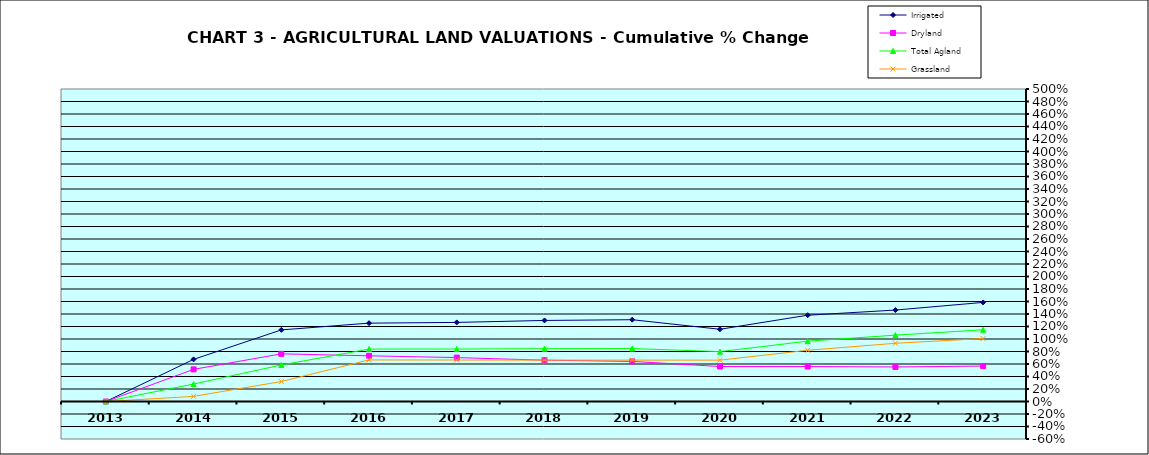
| Category | Irrigated | Dryland | Total Agland | Grassland |
|---|---|---|---|---|
| 2013.0 | 0 | 0 | 0 | 0 |
| 2014.0 | 0.674 | 0.514 | 0.279 | 0.082 |
| 2015.0 | 1.146 | 0.762 | 0.584 | 0.319 |
| 2016.0 | 1.254 | 0.731 | 0.839 | 0.665 |
| 2017.0 | 1.265 | 0.702 | 0.839 | 0.664 |
| 2018.0 | 1.297 | 0.661 | 0.845 | 0.662 |
| 2019.0 | 1.309 | 0.642 | 0.847 | 0.662 |
| 2020.0 | 1.156 | 0.56 | 0.798 | 0.662 |
| 2021.0 | 1.381 | 0.559 | 0.966 | 0.82 |
| 2022.0 | 1.463 | 0.552 | 1.062 | 0.931 |
| 2023.0 | 1.585 | 0.567 | 1.147 | 1.007 |